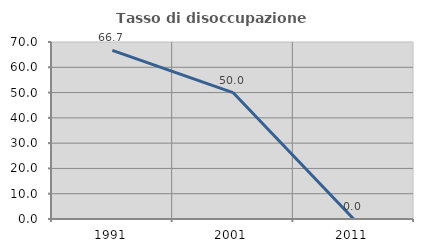
| Category | Tasso di disoccupazione giovanile  |
|---|---|
| 1991.0 | 66.667 |
| 2001.0 | 50 |
| 2011.0 | 0 |